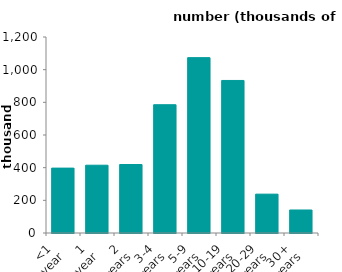
| Category | time in private rented sector |
|---|---|
| <1 
year | 397.287 |
| 1 
year | 415.001 |
| 2 
years | 419.353 |
| 3-4 
years | 785.485 |
| 5-9 
years | 1073.666 |
| 10-19 
years | 933.868 |
| 20-29 
years | 237.864 |
| 30+ 
years | 140.855 |